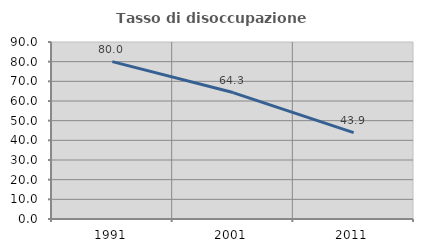
| Category | Tasso di disoccupazione giovanile  |
|---|---|
| 1991.0 | 80 |
| 2001.0 | 64.286 |
| 2011.0 | 43.902 |